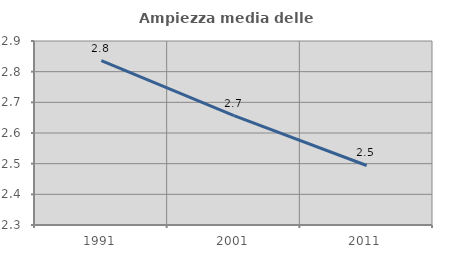
| Category | Ampiezza media delle famiglie |
|---|---|
| 1991.0 | 2.836 |
| 2001.0 | 2.657 |
| 2011.0 | 2.494 |